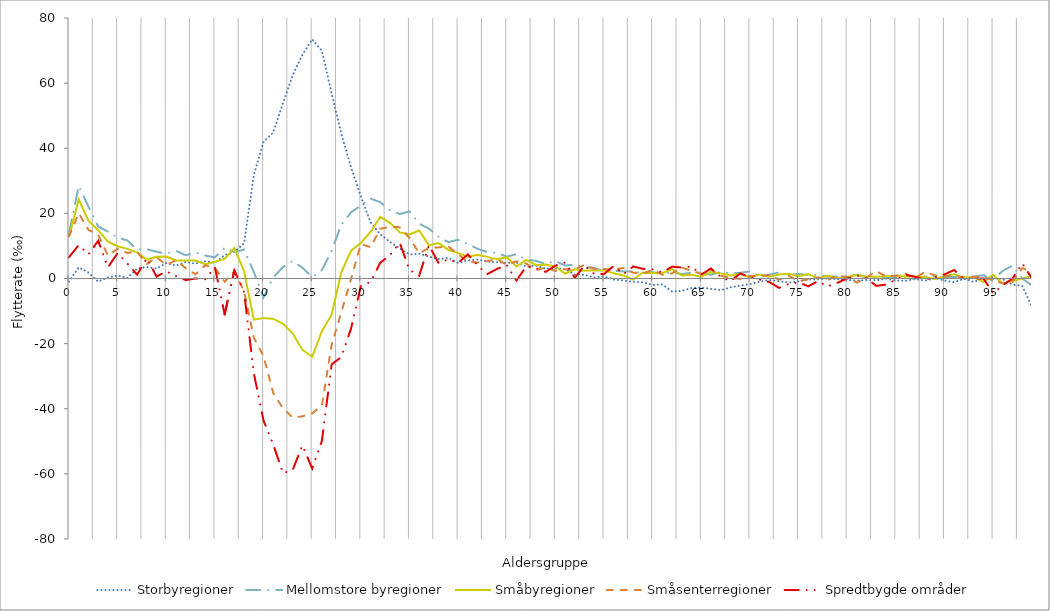
| Category | Storbyregioner | Mellomstore byregioner | Småbyregioner | Småsenterregioner | Spredtbygde områder |
|---|---|---|---|---|---|
| 0.0 | -0.984 | 13.841 | 12.713 | 12.956 | 6.57 |
| 1.0 | 3.422 | 28.411 | 24.337 | 20.055 | 10.254 |
| 2.0 | 1.823 | 22.058 | 17.688 | 14.957 | 7.403 |
| 3.0 | -0.957 | 16.005 | 14.841 | 13.387 | 11.6 |
| 4.0 | 0.328 | 14.414 | 11.339 | 7.073 | 3.452 |
| 5.0 | 0.934 | 12.564 | 9.911 | 9.107 | 7.803 |
| 6.0 | 0.109 | 11.692 | 9.099 | 7.856 | 4.606 |
| 7.0 | 3.035 | 8.873 | 8.029 | 8.241 | 1.184 |
| 8.0 | 3.581 | 9.02 | 5.82 | 4.422 | 6.26 |
| 9.0 | 3.048 | 8.206 | 6.666 | 6.591 | 0.595 |
| 10.0 | 4.749 | 7.613 | 6.752 | 4.125 | 2.22 |
| 11.0 | 3.975 | 8.487 | 5.519 | 5.589 | 0.729 |
| 12.0 | 5.06 | 7.148 | 5.541 | 3.185 | -0.479 |
| 13.0 | 4.607 | 7.969 | 5.519 | 1.284 | 0 |
| 14.0 | 5.237 | 7.049 | 4.38 | 4.054 | -0.233 |
| 15.0 | 4.862 | 6.495 | 5.117 | 3.264 | 3.441 |
| 16.0 | 7.172 | 9.399 | 6.045 | -1.004 | -11.011 |
| 17.0 | 8.156 | 8.139 | 9.326 | 2.212 | 2.461 |
| 18.0 | 10.834 | 8.897 | 2.233 | -3.963 | -4.163 |
| 19.0 | 31.731 | 1.988 | -12.655 | -18.183 | -29.104 |
| 20.0 | 42.028 | -5.795 | -12.157 | -23.848 | -43.634 |
| 21.0 | 44.871 | 0.341 | -12.43 | -35.207 | -51.002 |
| 22.0 | 53.885 | 3.511 | -13.937 | -39.868 | -59.795 |
| 23.0 | 62.45 | 5.373 | -16.828 | -42.706 | -58.742 |
| 24.0 | 68.763 | 3.282 | -21.934 | -42.339 | -51.261 |
| 25.0 | 73.474 | 0.46 | -24.029 | -41.42 | -58.335 |
| 26.0 | 69.868 | 2.587 | -16.195 | -39.001 | -49.847 |
| 27.0 | 56.821 | 8.524 | -11.113 | -20.377 | -26.409 |
| 28.0 | 44.388 | 16.53 | 2.006 | -10.285 | -24.082 |
| 29.0 | 34.096 | 20.307 | 8.531 | -0.107 | -15.333 |
| 30.0 | 25.241 | 22.401 | 10.894 | 10.559 | -2.348 |
| 31.0 | 17.256 | 24.542 | 14.302 | 9.619 | -1.017 |
| 32.0 | 13.57 | 23.43 | 18.899 | 15.264 | 4.835 |
| 33.0 | 11.194 | 20.993 | 17.106 | 15.882 | 7.213 |
| 34.0 | 9.266 | 19.797 | 14.169 | 15.754 | 10.972 |
| 35.0 | 7.385 | 20.602 | 13.544 | 12.479 | 2.628 |
| 36.0 | 7.613 | 16.798 | 14.75 | 7.718 | 0.868 |
| 37.0 | 6.725 | 15.35 | 10.175 | 9.384 | 10.231 |
| 38.0 | 5.968 | 12.767 | 10.884 | 9.56 | 4.704 |
| 39.0 | 6.365 | 11.173 | 8.836 | 9.816 | 5.904 |
| 40.0 | 4.774 | 11.901 | 7.797 | 7.406 | 4.83 |
| 41.0 | 5.54 | 10.612 | 6.721 | 5.153 | 7.411 |
| 42.0 | 5.851 | 9.13 | 7.304 | 4.926 | 4.031 |
| 43.0 | 5.228 | 8.104 | 6.648 | 5.335 | 1.349 |
| 44.0 | 5.016 | 7.856 | 5.94 | 5.96 | 2.944 |
| 45.0 | 4.797 | 6.702 | 6.544 | 4.19 | 4.132 |
| 46.0 | 4.859 | 7.469 | 3.683 | 5.297 | -0.636 |
| 47.0 | 3.71 | 5.715 | 5.717 | 4.585 | 3.651 |
| 48.0 | 3.97 | 5.447 | 4.156 | 2.542 | 3.234 |
| 49.0 | 2.994 | 4.47 | 4.323 | 3.406 | 2.026 |
| 50.0 | 3.102 | 5.388 | 3.708 | 2.307 | 3.94 |
| 51.0 | 2.902 | 3.973 | 1.533 | 2.872 | 4.916 |
| 52.0 | 1.245 | 4.279 | 2.812 | 2.722 | 0.23 |
| 53.0 | 1.11 | 3.417 | 2.402 | 4.249 | 3.96 |
| 54.0 | 0.321 | 3.293 | 2.566 | 2.917 | 1.442 |
| 55.0 | 0.69 | 2.172 | 2.492 | 2.899 | 1.36 |
| 56.0 | -0.321 | 2.404 | 1.587 | 2.748 | 3.831 |
| 57.0 | -0.606 | 2.154 | 0.924 | 3.231 | 1.343 |
| 58.0 | -1.016 | 2.182 | -0.313 | 1.778 | 3.707 |
| 59.0 | -1.155 | 1.502 | 1.829 | 1.525 | 2.973 |
| 60.0 | -1.946 | 1.902 | 1.707 | 2.64 | 2.778 |
| 61.0 | -1.844 | 1.587 | 1.627 | 1.173 | 1.912 |
| 62.0 | -4.014 | 1.888 | 2.882 | 1.594 | 3.629 |
| 63.0 | -3.826 | 1.399 | 0.904 | 3.388 | 3.38 |
| 64.0 | -2.92 | 1.745 | 1.169 | 2.337 | 3.648 |
| 65.0 | -2.753 | 1.999 | 0.554 | 1.452 | 1.193 |
| 66.0 | -3.174 | 1.142 | 1.966 | 2.773 | 3.097 |
| 67.0 | -3.595 | 1.993 | 1.572 | 0.835 | 0.509 |
| 68.0 | -2.721 | 1.653 | 0.948 | 0.192 | -0.856 |
| 69.0 | -2.198 | 1.731 | 1.431 | -0.121 | 1.559 |
| 70.0 | -1.716 | 2.16 | 0.35 | 0.798 | 0.459 |
| 71.0 | -0.987 | 0.74 | 1.198 | 0.736 | -0.354 |
| 72.0 | -0.503 | 1.154 | 0.54 | 1.07 | -1.101 |
| 73.0 | -0.819 | 1.883 | 1.248 | -0.366 | -2.885 |
| 74.0 | -1.241 | 1.17 | 1.445 | 0.792 | -1.658 |
| 75.0 | -0.873 | 1.381 | 0.664 | -0.761 | -1.177 |
| 76.0 | -0.307 | 1.08 | 1.35 | -0.291 | -2.406 |
| 77.0 | -0.271 | 1.121 | 0 | 0.346 | -0.82 |
| 78.0 | 0.029 | 0.575 | 0.849 | -0.454 | -2.391 |
| 79.0 | -0.227 | 0.594 | 0.124 | 0.931 | -1.305 |
| 80.0 | -0.409 | 0.713 | 0.451 | 0.375 | 0 |
| 81.0 | -0.643 | 1.135 | 1.07 | -1.282 | 0.943 |
| 82.0 | -0.467 | 0.309 | 0.594 | 0.349 | 0 |
| 83.0 | -0.494 | 0.459 | 0.518 | 2.277 | -2.279 |
| 84.0 | -0.077 | 0.258 | 0.671 | 0.59 | -1.87 |
| 85.0 | -0.568 | 0.231 | 0.862 | 0.857 | -0.404 |
| 86.0 | -0.73 | 0.087 | 0.632 | 1.426 | 1.135 |
| 87.0 | -0.16 | -0.132 | 0.613 | 0.176 | 0.514 |
| 88.0 | -0.681 | 0.652 | 0.456 | 2.017 | -0.296 |
| 89.0 | 0.111 | 0.598 | -0.156 | 0.946 | 0.347 |
| 90.0 | -0.631 | 0.397 | 0.666 | 0.712 | 1.259 |
| 91.0 | -1.137 | 0.432 | 1.321 | 0.881 | 2.606 |
| 92.0 | -0.073 | 0.56 | 0.309 | 0 | 0 |
| 93.0 | -1.042 | 0.604 | 0.399 | 0.578 | 0 |
| 94.0 | 0 | 0.992 | -1.07 | 0.386 | 0 |
| 95.0 | 0.174 | -0.23 | 1.104 | -0.522 | -4.481 |
| 96.0 | -0.247 | 2.339 | -1.598 | -1.496 | -2.077 |
| 97.0 | -1.838 | 3.967 | -0.769 | -1.07 | 0 |
| 98.0 | -2.28 | 0 | 0 | 3.185 | 4.651 |
| 99.0 | -8.782 | -2.175 | 0.743 | 2.199 | 0 |